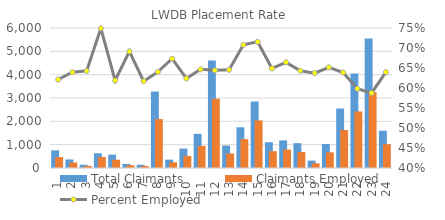
| Category | Total Claimants | Claimants Employed |
|---|---|---|
| 1.0 | 755 | 469 |
| 2.0 | 366 | 234 |
| 3.0 | 140 | 90 |
| 4.0 | 630 | 472 |
| 5.0 | 572 | 354 |
| 6.0 | 175 | 121 |
| 7.0 | 141 | 87 |
| 8.0 | 3277 | 2098 |
| 9.0 | 358 | 241 |
| 10.0 | 832 | 519 |
| 11.0 | 1463 | 946 |
| 12.0 | 4611 | 2970 |
| 13.0 | 962 | 621 |
| 14.0 | 1746 | 1236 |
| 15.0 | 2850 | 2039 |
| 16.0 | 1105 | 717 |
| 17.0 | 1185 | 787 |
| 18.0 | 1065 | 685 |
| 19.0 | 317 | 202 |
| 20.0 | 1028 | 670 |
| 21.0 | 2550 | 1629 |
| 22.0 | 4049 | 2422 |
| 23.0 | 5553 | 3264 |
| 24.0 | 1596 | 1021 |